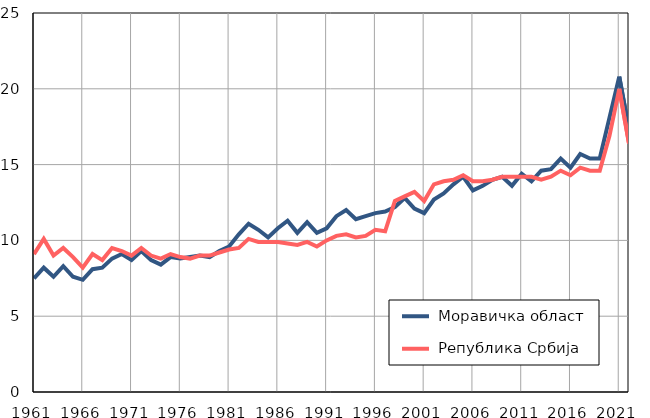
| Category |  Моравичка област |  Република Србија |
|---|---|---|
| 1961.0 | 7.5 | 9.1 |
| 1962.0 | 8.2 | 10.1 |
| 1963.0 | 7.6 | 9 |
| 1964.0 | 8.3 | 9.5 |
| 1965.0 | 7.6 | 8.9 |
| 1966.0 | 7.4 | 8.2 |
| 1967.0 | 8.1 | 9.1 |
| 1968.0 | 8.2 | 8.7 |
| 1969.0 | 8.8 | 9.5 |
| 1970.0 | 9.1 | 9.3 |
| 1971.0 | 8.7 | 9 |
| 1972.0 | 9.3 | 9.5 |
| 1973.0 | 8.7 | 9 |
| 1974.0 | 8.4 | 8.8 |
| 1975.0 | 8.9 | 9.1 |
| 1976.0 | 8.8 | 8.9 |
| 1977.0 | 8.9 | 8.8 |
| 1978.0 | 9 | 9 |
| 1979.0 | 8.9 | 9 |
| 1980.0 | 9.3 | 9.2 |
| 1981.0 | 9.6 | 9.4 |
| 1982.0 | 10.4 | 9.5 |
| 1983.0 | 11.1 | 10.1 |
| 1984.0 | 10.7 | 9.9 |
| 1985.0 | 10.2 | 9.9 |
| 1986.0 | 10.8 | 9.9 |
| 1987.0 | 11.3 | 9.8 |
| 1988.0 | 10.5 | 9.7 |
| 1989.0 | 11.2 | 9.9 |
| 1990.0 | 10.5 | 9.6 |
| 1991.0 | 10.8 | 10 |
| 1992.0 | 11.6 | 10.3 |
| 1993.0 | 12 | 10.4 |
| 1994.0 | 11.4 | 10.2 |
| 1995.0 | 11.6 | 10.3 |
| 1996.0 | 11.8 | 10.7 |
| 1997.0 | 11.9 | 10.6 |
| 1998.0 | 12.2 | 12.6 |
| 1999.0 | 12.8 | 12.9 |
| 2000.0 | 12.1 | 13.2 |
| 2001.0 | 11.8 | 12.6 |
| 2002.0 | 12.7 | 13.7 |
| 2003.0 | 13.1 | 13.9 |
| 2004.0 | 13.7 | 14 |
| 2005.0 | 14.2 | 14.3 |
| 2006.0 | 13.3 | 13.9 |
| 2007.0 | 13.6 | 13.9 |
| 2008.0 | 14 | 14 |
| 2009.0 | 14.2 | 14.2 |
| 2010.0 | 13.6 | 14.2 |
| 2011.0 | 14.4 | 14.2 |
| 2012.0 | 13.9 | 14.2 |
| 2013.0 | 14.6 | 14 |
| 2014.0 | 14.7 | 14.2 |
| 2015.0 | 15.4 | 14.6 |
| 2016.0 | 14.8 | 14.3 |
| 2017.0 | 15.7 | 14.8 |
| 2018.0 | 15.4 | 14.6 |
| 2019.0 | 15.4 | 14.6 |
| 2020.0 | 18.1 | 16.9 |
| 2021.0 | 20.8 | 20 |
| 2022.0 | 17.3 | 16.4 |